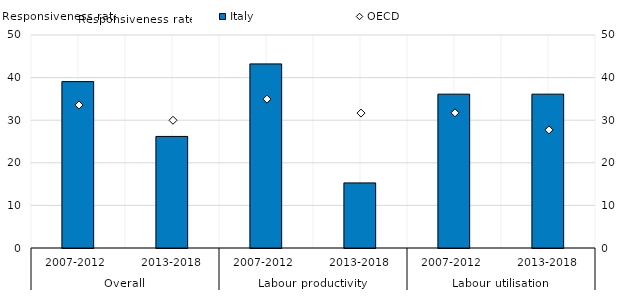
| Category | Italy |
|---|---|
| 0 | 39.057 |
| 1 | 26.19 |
| 2 | 43.214 |
| 3 | 15.278 |
| 4 | 36.111 |
| 5 | 36.111 |